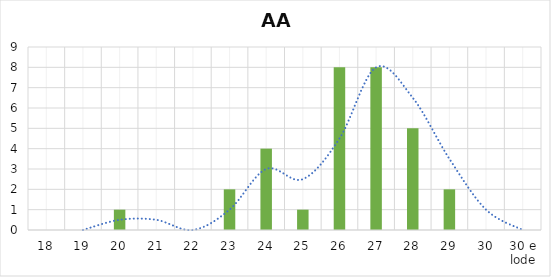
| Category | Series 0 |
|---|---|
| 18 | 0 |
| 19 | 0 |
| 20 | 1 |
| 21 | 0 |
| 22 | 0 |
| 23 | 2 |
| 24 | 4 |
| 25 | 1 |
| 26 | 8 |
| 27 | 8 |
| 28 | 5 |
| 29 | 2 |
| 30 | 0 |
| 30 e lode | 0 |